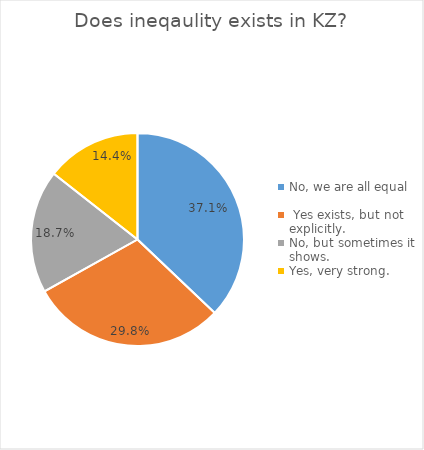
| Category | Series 0 |
|---|---|
| No, we are all equal | 0.371 |
|  Yes exists, but not explicitly. | 0.298 |
| No, but sometimes it shows. | 0.187 |
| Yes, very strong. | 0.144 |